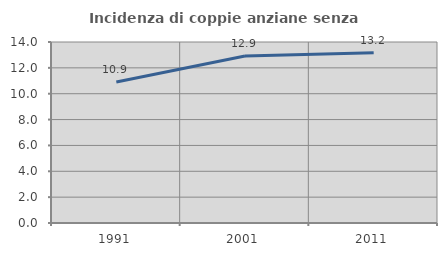
| Category | Incidenza di coppie anziane senza figli  |
|---|---|
| 1991.0 | 10.906 |
| 2001.0 | 12.917 |
| 2011.0 | 13.169 |